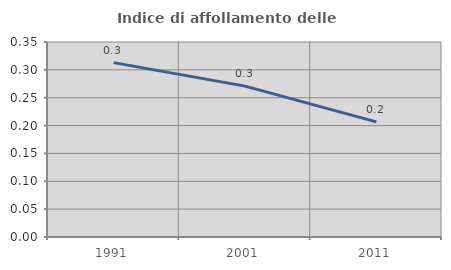
| Category | Indice di affollamento delle abitazioni  |
|---|---|
| 1991.0 | 0.313 |
| 2001.0 | 0.271 |
| 2011.0 | 0.207 |